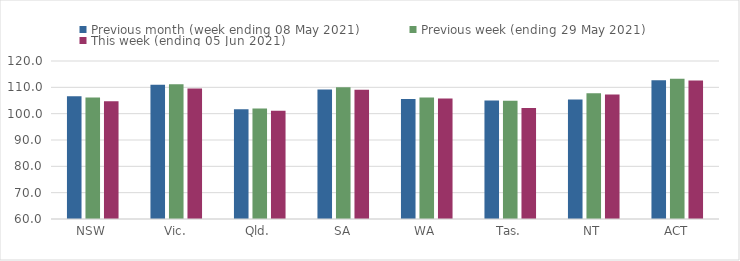
| Category | Previous month (week ending 08 May 2021) | Previous week (ending 29 May 2021) | This week (ending 05 Jun 2021) |
|---|---|---|---|
| NSW | 106.6 | 106.13 | 104.69 |
| Vic. | 111.01 | 111.19 | 109.54 |
| Qld. | 101.67 | 101.98 | 101.1 |
| SA | 109.15 | 110.04 | 109.06 |
| WA | 105.61 | 106.18 | 105.79 |
| Tas. | 105 | 104.86 | 102.16 |
| NT | 105.35 | 107.77 | 107.26 |
| ACT | 112.68 | 113.22 | 112.6 |